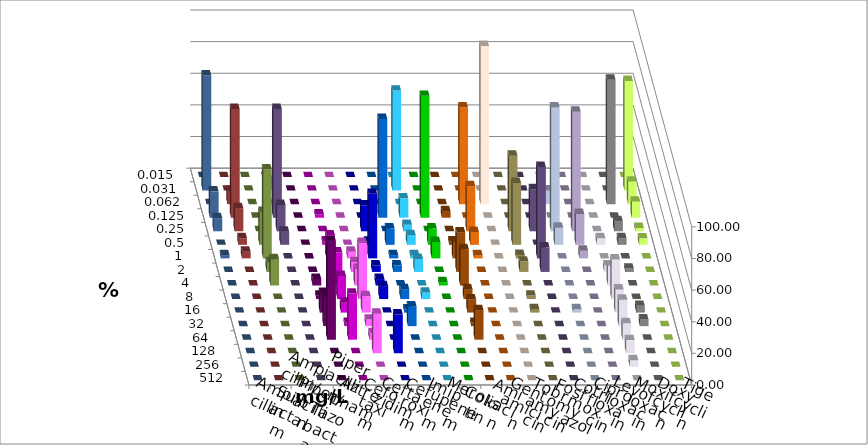
| Category | Ampicillin | Ampicillin/ Sulbactam | Piperacillin | Piperacillin/ Tazobactam | Aztreonam | Cefotaxim | Ceftazidim | Cefuroxim | Imipenem | Meropenem | Colistin | Amikacin | Gentamicin | Tobramycin | Fosfomycin | Cotrimoxazol | Ciprofloxacin | Levofloxacin | Moxifloxacin | Doxycyclin | Tigecyclin |
|---|---|---|---|---|---|---|---|---|---|---|---|---|---|---|---|---|---|---|---|---|---|
| 0.015 | 0 | 0 | 0 | 0 | 0 | 0 | 0 | 0 | 0 | 0 | 0 | 0 | 0 | 0 | 0 | 0 | 0 | 0 | 0 | 0 | 0 |
| 0.031 | 0 | 0 | 0 | 0 | 0 | 63.265 | 0 | 0 | 0 | 0 | 0 | 0 | 0 | 0 | 0 | 0 | 69.388 | 72.917 | 0 | 0 | 6.25 |
| 0.062 | 0 | 0 | 0 | 0 | 0 | 0 | 0 | 0 | 61.224 | 100 | 0 | 0 | 8.696 | 0 | 0 | 78.723 | 14.286 | 0 | 8.333 | 0 | 0 |
| 0.125 | 0 | 2.083 | 0 | 0 | 62.5 | 12.245 | 77.083 | 4.167 | 0 | 0 | 0 | 0 | 0 | 0 | 0 | 0 | 10.204 | 16.667 | 68.75 | 0 | 68.75 |
| 0.25 | 0 | 0 | 0 | 16.327 | 0 | 4.082 | 0 | 0 | 28.571 | 0 | 47.826 | 26.667 | 78.261 | 75.61 | 0 | 6.383 | 2.041 | 8.333 | 14.583 | 0 | 16.667 |
| 0.5 | 0 | 2.083 | 0 | 2.041 | 10.417 | 6.122 | 10.417 | 2.083 | 8.163 | 0 | 39.13 | 0 | 10.87 | 19.512 | 4.167 | 4.255 | 4.082 | 0 | 4.167 | 20.833 | 8.333 |
| 1.0 | 0 | 14.583 | 4.167 | 40.816 | 2.083 | 2.041 | 10.417 | 10.417 | 2.041 | 0 | 2.174 | 57.778 | 0 | 4.878 | 0 | 0 | 0 | 2.083 | 4.167 | 56.25 | 0 |
| 2.0 | 0 | 8.333 | 6.25 | 4.082 | 4.167 | 8.163 | 0 | 25 | 0 | 0 | 6.522 | 15.556 | 0 | 0 | 4.167 | 2.128 | 0 | 0 | 0 | 6.25 | 0 |
| 4.0 | 4.167 | 20.833 | 10.417 | 4.082 | 0 | 0 | 2.083 | 22.917 | 0 | 0 | 0 | 0 | 0 | 0 | 12.5 | 0 | 0 | 0 | 0 | 16.667 | 0 |
| 8.0 | 2.083 | 14.583 | 35.417 | 8.163 | 6.25 | 4.082 | 0 | 6.25 | 0 | 0 | 2.174 | 0 | 0 | 0 | 25 | 0 | 0 | 0 | 0 | 0 | 0 |
| 16.0 | 12.5 | 6.25 | 10.417 | 0 | 2.083 | 0 | 0 | 8.333 | 0 | 0 | 2.174 | 0 | 2.174 | 0 | 14.583 | 4.255 | 0 | 0 | 0 | 0 | 0 |
| 32.0 | 18.75 | 2.083 | 4.167 | 0 | 12.5 | 0 | 0 | 2.083 | 0 | 0 | 0 | 0 | 0 | 0 | 16.667 | 4.255 | 0 | 0 | 0 | 0 | 0 |
| 64.0 | 62.5 | 29.167 | 4.167 | 0 | 0 | 0 | 0 | 18.75 | 0 | 0 | 0 | 0 | 0 | 0 | 10.417 | 0 | 0 | 0 | 0 | 0 | 0 |
| 128.0 | 0 | 0 | 25 | 24.49 | 0 | 0 | 0 | 0 | 0 | 0 | 0 | 0 | 0 | 0 | 8.333 | 0 | 0 | 0 | 0 | 0 | 0 |
| 256.0 | 0 | 0 | 0 | 0 | 0 | 0 | 0 | 0 | 0 | 0 | 0 | 0 | 0 | 0 | 4.167 | 0 | 0 | 0 | 0 | 0 | 0 |
| 512.0 | 0 | 0 | 0 | 0 | 0 | 0 | 0 | 0 | 0 | 0 | 0 | 0 | 0 | 0 | 0 | 0 | 0 | 0 | 0 | 0 | 0 |